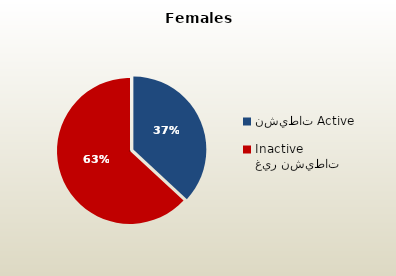
| Category | الاناث القطريات  Qatari Females |
|---|---|
| نشيطات Active | 36736 |
| غير نشيطات Inactive | 62832 |